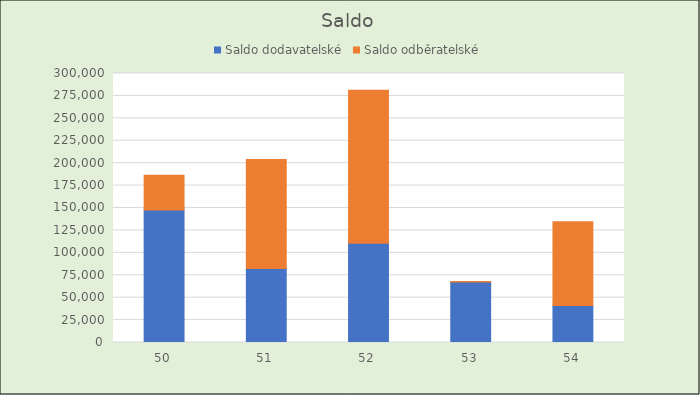
| Category | Saldo dodavatelské | Saldo odběratelské |
|---|---|---|
| 50.0 | 147725.5 | 38720 |
| 51.0 | 82600 | 121476.28 |
| 52.0 | 110715 | 170730 |
| 53.0 | 67470 | 650 |
| 54.0 | 41155 | 93594 |